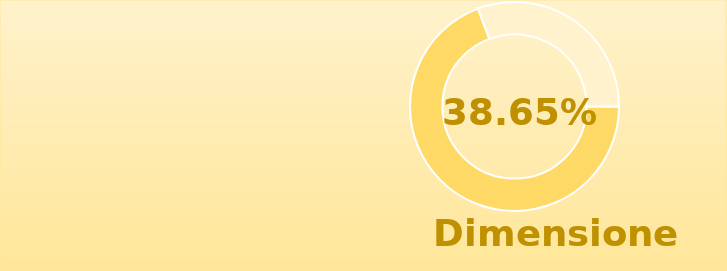
| Category | Series 0 |
|---|---|
| 0 | 1.386 |
| 1 | 0.614 |